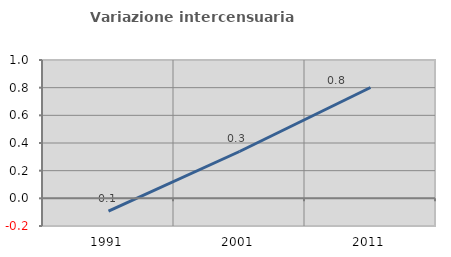
| Category | Variazione intercensuaria annua |
|---|---|
| 1991.0 | -0.092 |
| 2001.0 | 0.339 |
| 2011.0 | 0.801 |